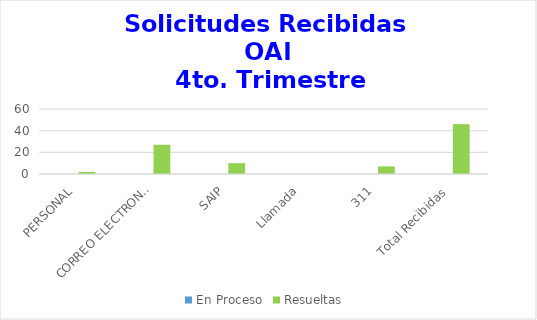
| Category | En Proceso | Resueltas  |
|---|---|---|
| PERSONAL | 0 | 2 |
| CORREO ELECTRONICO | 0 | 27 |
| SAIP | 0 | 10 |
| Llamada | 0 | 0 |
| 311 | 0 | 7 |
| Total Recibidas | 0 | 46 |